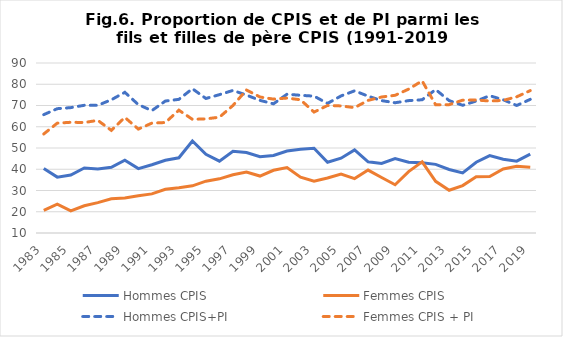
| Category | Hommes CPIS | Femmes CPIS | Hommes CPIS+PI | Femmes CPIS + PI |
|---|---|---|---|---|
| 1983.0 | 40.4 | 20.7 | 65.7 | 56.6 |
| 1984.0 | 36.3 | 23.6 | 68.5 | 61.7 |
| 1985.0 | 37.3 | 20.4 | 69 | 62.1 |
| 1986.0 | 40.6 | 22.8 | 70.1 | 62 |
| 1987.0 | 40.1 | 24.3 | 70.1 | 63 |
| 1988.0 | 40.9 | 26.1 | 72.7 | 58.3 |
| 1989.0 | 44.3 | 26.5 | 76.2 | 64.4 |
| 1990.0 | 40.3 | 27.5 | 70.4 | 58.9 |
| 1991.0 | 42.1 | 28.4 | 67.6 | 61.7 |
| 1992.0 | 44.2 | 30.6 | 72.1 | 62 |
| 1993.0 | 45.4 | 31.3 | 72.9 | 67.8 |
| 1994.0 | 53.3 | 32.2 | 77.9 | 63.5 |
| 1995.0 | 47 | 34.4 | 73.3 | 63.7 |
| 1996.0 | 43.8 | 35.5 | 75.1 | 64.5 |
| 1997.0 | 48.5 | 37.4 | 77.1 | 70 |
| 1998.0 | 47.9 | 38.7 | 74.9 | 77.3 |
| 1999.0 | 45.9 | 36.8 | 72.4 | 74 |
| 2000.0 | 46.5 | 39.5 | 70.8 | 73 |
| 2001.0 | 48.6 | 40.8 | 75.3 | 73.5 |
| 2002.0 | 49.4 | 36.3 | 74.8 | 72.7 |
| 2003.0 | 49.9 | 34.4 | 74.4 | 66.9 |
| 2004.0 | 43.3 | 35.9 | 71 | 70 |
| 2005.0 | 45.2 | 37.7 | 74.5 | 69.8 |
| 2006.0 | 49.1 | 35.6 | 76.9 | 69 |
| 2007.0 | 43.5 | 39.6 | 74.4 | 72.4 |
| 2008.0 | 42.7 | 36.1 | 72.3 | 74 |
| 2009.0 | 45 | 32.7 | 71.3 | 74.8 |
| 2010.0 | 43.3 | 38.9 | 72.3 | 77.7 |
| 2011.0 | 43.1 | 43.5 | 72.7 | 81.6 |
| 2012.0 | 42.3 | 34.3 | 77.5 | 70.3 |
| 2013.0 | 39.9 | 30.1 | 72.3 | 70.4 |
| 2014.0 | 38.3 | 32.3 | 70.1 | 72.5 |
| 2015.0 | 43.3 | 36.5 | 72.1 | 72.6 |
| 2016.0 | 46.4 | 36.6 | 74.6 | 72.1 |
| 2017.0 | 44.7 | 40.1 | 72.7 | 72.4 |
| 2018.0 | 43.8 | 41.4 | 70 | 74.1 |
| 2019.0 | 47.1 | 40.9 | 72.9 | 77 |